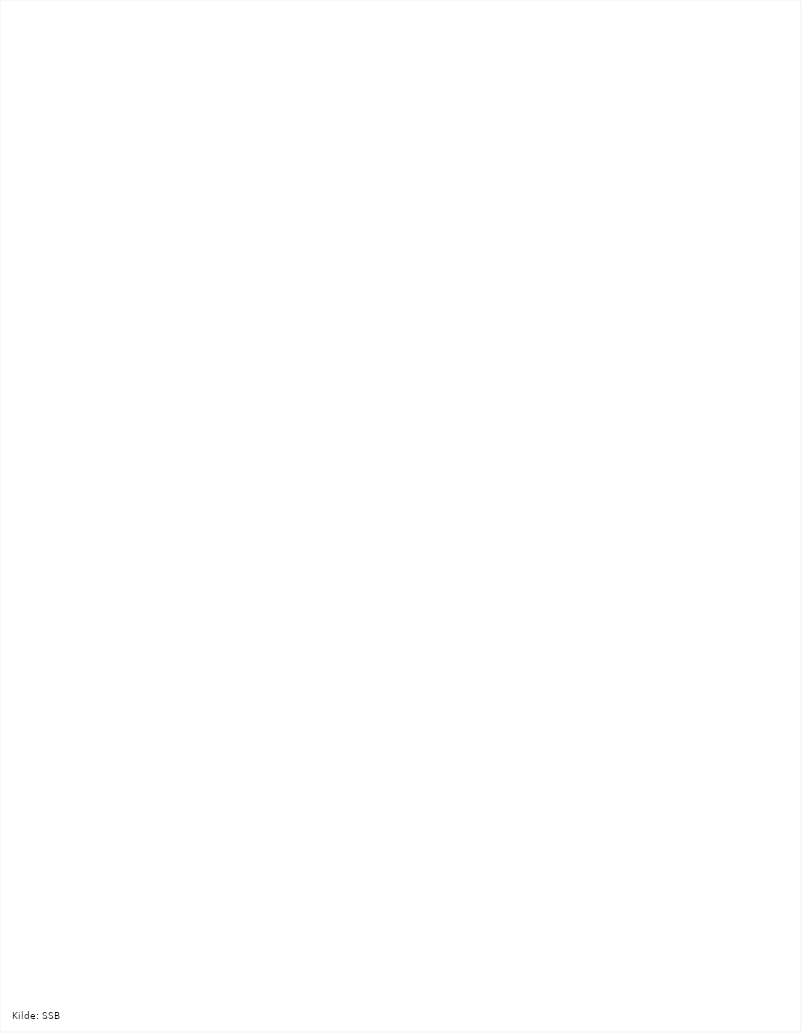
| Category | dyrka | dyrkbar |
|---|---|---|
| Namsskogan | 1 | 0 |
| Leka | 11 | 0 |
| Verran | 4 | 13 |
| Fosnes | 22 | 12 |
| Flatanger | 44 | 8 |
| Røyrvik | 39 | 15 |
| Osen | 52 | 3 |
| Namdalseid | 45 | 15 |
| Rindal | 63 | 20 |
| Snåsa | 76 | 15 |
| Høylandet | 50 | 52 |
| Midtre Gauldal | 83 | 30 |
| Snillfjord | 91 | 23 |
| Roan | 80 | 42 |
| Vikna | 121 | 10 |
| Åfjord | 123 | 8 |
| Frosta | 135 | 3 |
| Meldal | 64 | 83 |
| Nærøy | 80 | 108 |
| Meråker | 124 | 82 |
| Inderøy | 206 | 12 |
| Namsos | 106 | 118 |
| Agdenes | 191 | 40 |
| Klæbu | 58 | 196 |
| Lierne | 89 | 199 |
| Indre Fosen | 205 | 94 |
| Frøya | 255 | 48 |
| Overhalla | 178 | 163 |
| Hemne | 293 | 79 |
| Skaun | 389 | 5 |
| Selbu | 288 | 156 |
| Levanger | 408 | 56 |
| Grong | 242 | 226 |
| Bjugn | 345 | 130 |
| Tydal | 16 | 477 |
| Hitra | 409 | 94 |
| Malvik | 384 | 133 |
| Rennebu | 301 | 296 |
| Verdal | 442 | 275 |
| Holtålen | 134 | 597 |
| Orkdal | 701 | 88 |
| Stjørdal | 666 | 271 |
| Steinkjer | 792 | 323 |
| Røros | 358 | 823 |
| Oppdal | 357 | 927 |
| Ørland | 1136 | 200 |
| Melhus | 2371 | 195 |
| Trondheim | 3227 | 1336 |